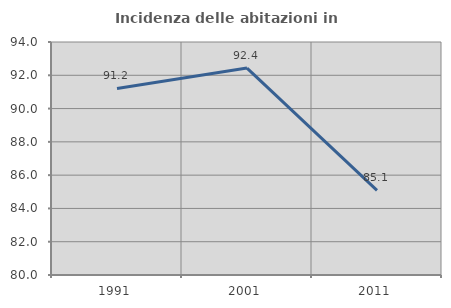
| Category | Incidenza delle abitazioni in proprietà  |
|---|---|
| 1991.0 | 91.211 |
| 2001.0 | 92.432 |
| 2011.0 | 85.09 |